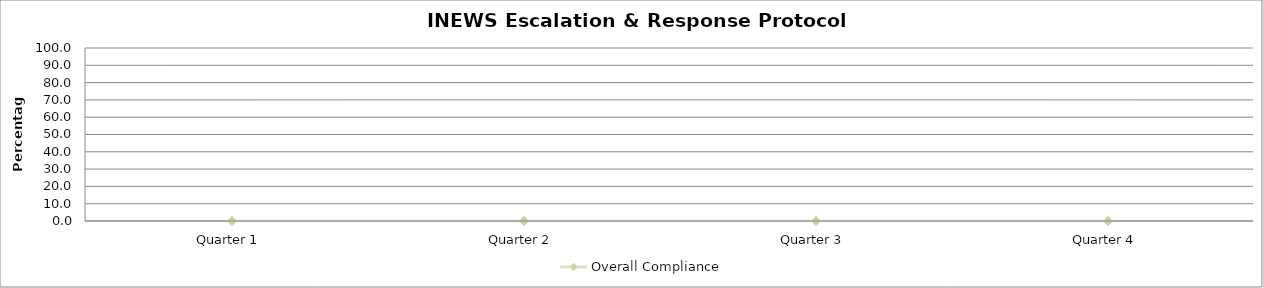
| Category | Overall Compliance |
|---|---|
| Quarter 1 | 0 |
| Quarter 2 | 0 |
| Quarter 3 | 0 |
| Quarter 4 | 0 |